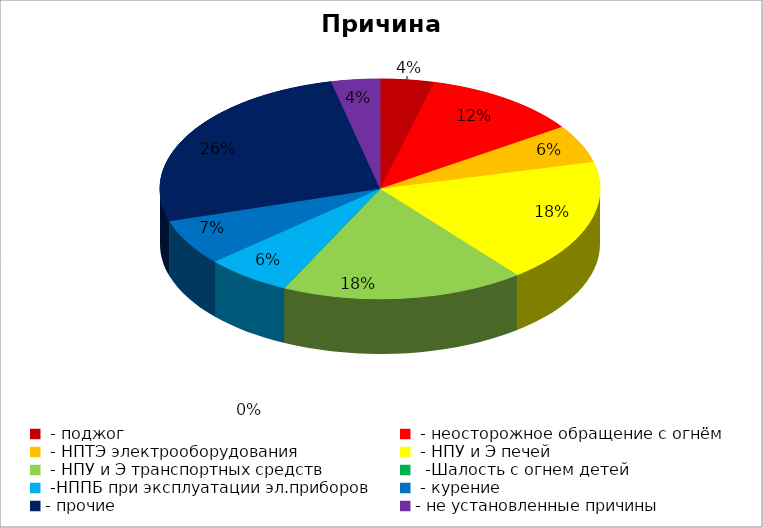
| Category | Причина пожара |
|---|---|
|  - поджог | 10 |
|  - неосторожное обращение с огнём | 29 |
|  - НПТЭ электрооборудования | 14 |
|  - НПУ и Э печей | 46 |
|  - НПУ и Э транспортных средств | 45 |
|   -Шалость с огнем детей | 0 |
|  -НППБ при эксплуатации эл.приборов | 16 |
|  - курение | 17 |
| - прочие | 66 |
| - не установленные причины | 9 |